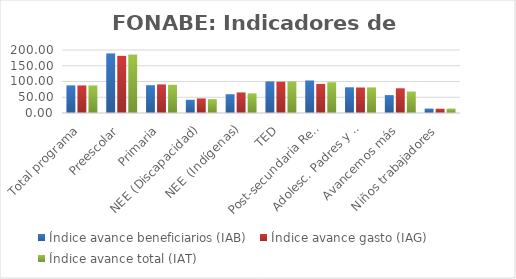
| Category | Índice avance beneficiarios (IAB)  | Índice avance gasto (IAG) | Índice avance total (IAT)  |
|---|---|---|---|
| Total programa | 87.723 | 87.563 | 87.643 |
| Preescolar | 188.834 | 181.441 | 185.137 |
| Primaria | 88.252 | 90.47 | 89.361 |
| NEE (Discapacidad) | 41.806 | 46.347 | 44.076 |
| NEE (Indígenas) | 59.583 | 64.999 | 62.291 |
| TED | 99.917 | 99.19 | 99.554 |
| Post-secundaria Regular | 103.056 | 92.24 | 97.648 |
| Adolesc. Padres y Madres | 81.609 | 80.973 | 81.291 |
| Avancemos más | 56.805 | 78.459 | 67.632 |
| Niños trabajadores | 13.854 | 13.497 | 13.675 |